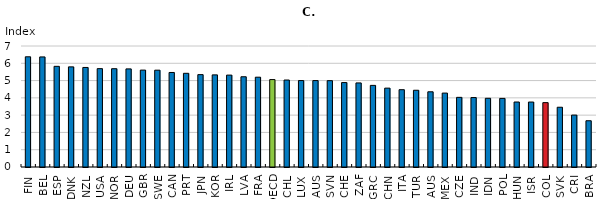
| Category | Ports |
|---|---|
| FIN | 6.376 |
| BEL | 6.368 |
| ESP | 5.823 |
| DNK | 5.792 |
| NZL | 5.758 |
| USA | 5.69 |
| NOR | 5.686 |
| DEU | 5.675 |
| GBR | 5.605 |
| SWE | 5.601 |
| CAN | 5.468 |
| PRT | 5.42 |
| JPN | 5.343 |
| KOR | 5.329 |
| IRL | 5.316 |
| LVA | 5.221 |
| FRA | 5.196 |
| OECD | 5.057 |
| CHL | 5.032 |
| LUX | 5 |
| AUS | 5 |
| SVN | 4.994 |
| CHE | 4.885 |
| ZAF | 4.863 |
| GRC | 4.722 |
| CHN | 4.563 |
| ITA | 4.472 |
| TUR | 4.44 |
| AUS | 4.351 |
| MEX | 4.276 |
| CZE | 4.029 |
| IND | 4.018 |
| IDN | 3.975 |
| POL | 3.969 |
| HUN | 3.76 |
| ISR | 3.758 |
| COL | 3.723 |
| SVK | 3.457 |
| CRI | 3.004 |
| BRA | 2.676 |